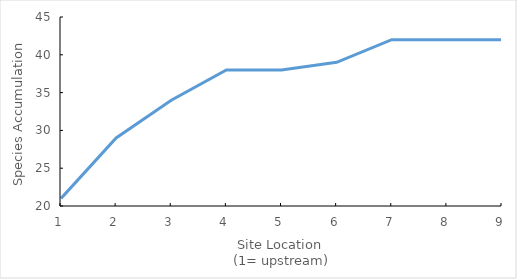
| Category | Series 0 |
|---|---|
| 0 | 21 |
| 1 | 29 |
| 2 | 34 |
| 3 | 38 |
| 4 | 38 |
| 5 | 39 |
| 6 | 42 |
| 7 | 42 |
| 8 | 42 |